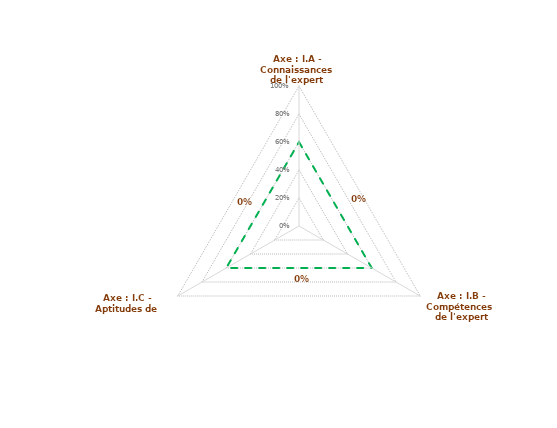
| Category | capacité de l'expert | Seuil limite |
|---|---|---|
| Axe : I.A - Connaissances de l'expert | 0 | 0.6 |
| Axe : I.B - Compétences  de l'expert | 0 | 0.6 |
| Axe : I.C - Aptitudes de l'expert | 0 | 0.6 |